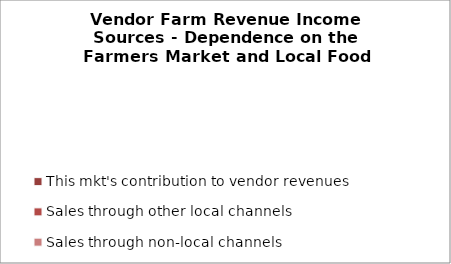
| Category | This mkt's contribution to vendor revenues | Sales through other local channels | Sales through non-local channels | Other farm revenue (e.g. Farm dinners, Venue rental, Workshops) |
|---|---|---|---|---|
| 0 | 0 | 0 | 0 | 0 |